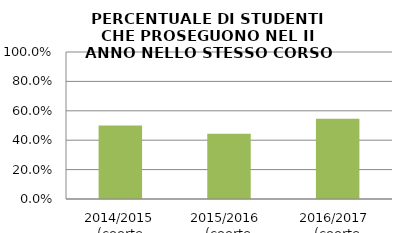
| Category | 2014/2015 (coorte 2013/14) 2015/2016  (coorte 2014/15) 2016/2017  (coorte 2015/16) |
|---|---|
| 2014/2015 (coorte 2013/14) | 0.5 |
| 2015/2016  (coorte 2014/15) | 0.444 |
| 2016/2017  (coorte 2015/16) | 0.545 |